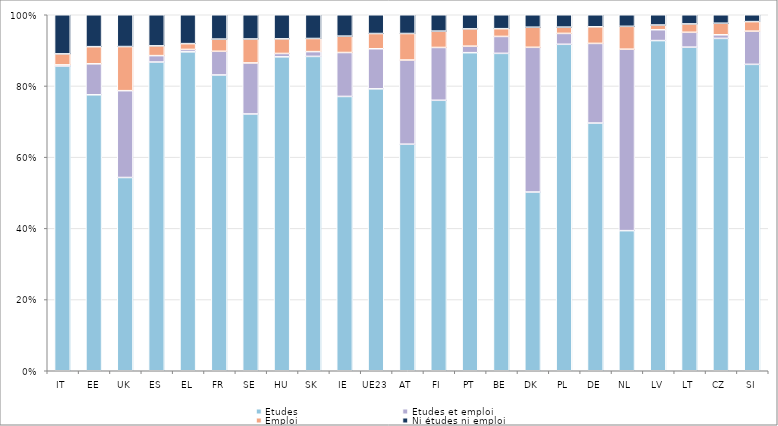
| Category | Études | Études et emploi | Emploi | Ni études ni emploi |
|---|---|---|---|---|
| IT | 85.573 | 0.349 | 3.09 | 10.988 |
| EE | 77.516 | 8.705 | 4.814 | 8.966 |
| UK | 54.288 | 24.389 | 12.393 | 8.93 |
| ES | 86.722 | 1.798 | 2.744 | 8.736 |
| EL | 89.579 | 0.676 | 1.63 | 8.115 |
| FR | 83.085 | 6.656 | 3.422 | 6.836 |
| SE | 72.128 | 14.34 | 6.728 | 6.804 |
| HU | 88.18 | 0.947 | 4.105 | 6.768 |
| SK | 88.299 | 1.345 | 3.686 | 6.67 |
| IE | 77.055 | 12.34 | 4.598 | 6.007 |
| UE23 | 79.315 | 11.276 | 4.289 | 5.28 |
| AT | 63.641 | 23.646 | 7.445 | 5.267 |
| FI | 75.972 | 14.841 | 4.594 | 4.594 |
| PT | 89.351 | 1.826 | 4.856 | 3.967 |
| BE | 89.155 | 4.757 | 2.173 | 3.915 |
| DK | 50.206 | 40.65 | 5.642 | 3.502 |
| PL | 91.701 | 3.061 | 1.766 | 3.473 |
| DE | 69.578 | 22.376 | 4.667 | 3.38 |
| NL | 39.359 | 50.966 | 6.421 | 3.254 |
| LV | 92.745 | 3.052 | 1.318 | 2.884 |
| LT | 90.9 | 4.175 | 2.345 | 2.58 |
| CZ | 93.36 | 1.009 | 3.247 | 2.384 |
| SI | 86.066 | 9.325 | 2.68 | 1.929 |